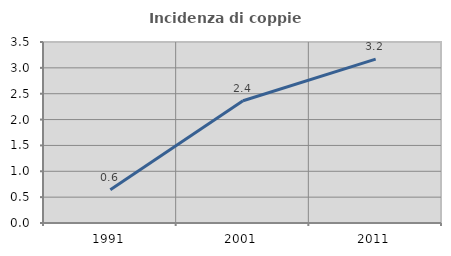
| Category | Incidenza di coppie miste |
|---|---|
| 1991.0 | 0.645 |
| 2001.0 | 2.364 |
| 2011.0 | 3.17 |